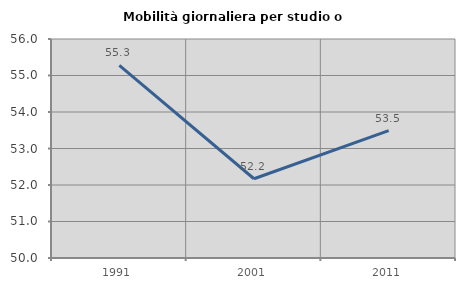
| Category | Mobilità giornaliera per studio o lavoro |
|---|---|
| 1991.0 | 55.277 |
| 2001.0 | 52.171 |
| 2011.0 | 53.49 |